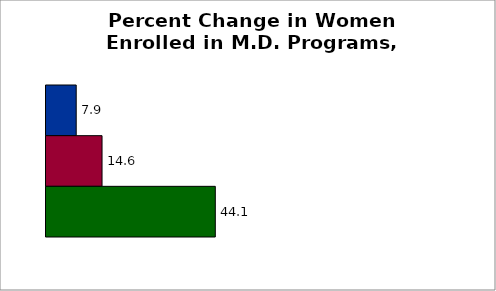
| Category | 50 states and D.C. | SREB states | State |
|---|---|---|---|
| 0 | 7.873 | 14.604 | 44.118 |